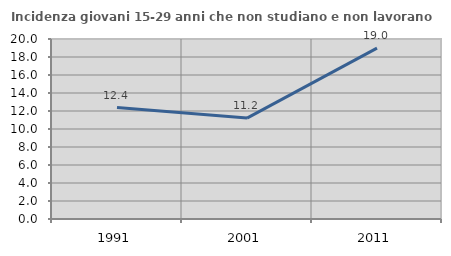
| Category | Incidenza giovani 15-29 anni che non studiano e non lavorano  |
|---|---|
| 1991.0 | 12.376 |
| 2001.0 | 11.212 |
| 2011.0 | 18.984 |